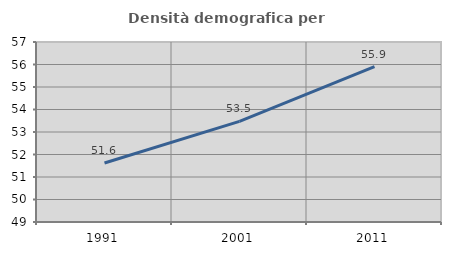
| Category | Densità demografica |
|---|---|
| 1991.0 | 51.623 |
| 2001.0 | 53.474 |
| 2011.0 | 55.903 |